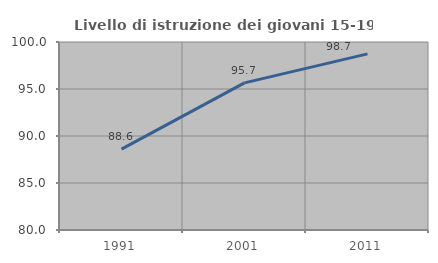
| Category | Livello di istruzione dei giovani 15-19 anni |
|---|---|
| 1991.0 | 88.596 |
| 2001.0 | 95.652 |
| 2011.0 | 98.734 |